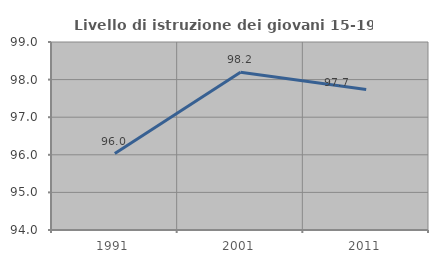
| Category | Livello di istruzione dei giovani 15-19 anni |
|---|---|
| 1991.0 | 96.032 |
| 2001.0 | 98.198 |
| 2011.0 | 97.739 |